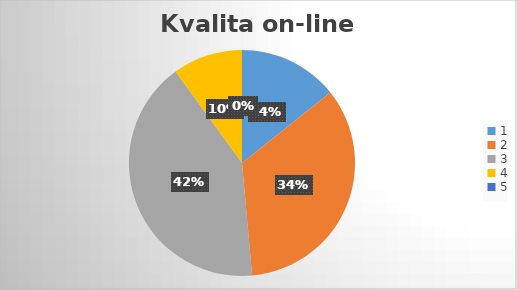
| Category | Series 0 |
|---|---|
| 0 | 10 |
| 1 | 24 |
| 2 | 29 |
| 3 | 7 |
| 4 | 0 |